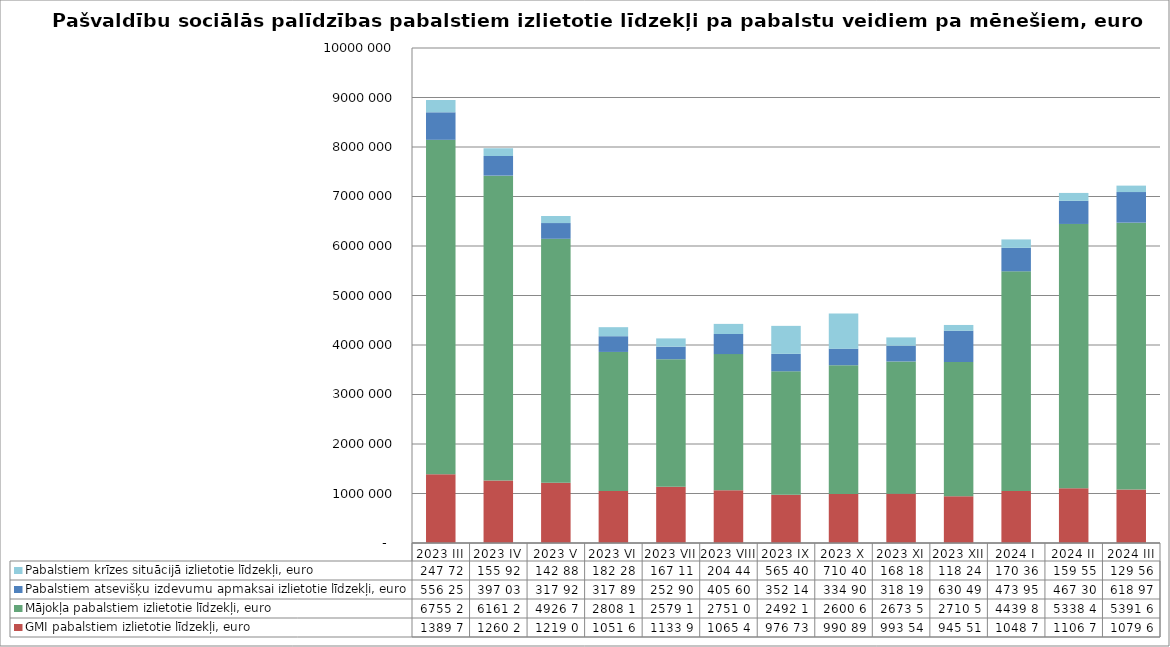
| Category | GMI pabalstiem izlietotie līdzekļi, euro | Mājokļa pabalstiem izlietotie līdzekļi, euro | Pabalstiem atsevišķu izdevumu apmaksai izlietotie līdzekļi, euro | Pabalstiem krīzes situācijā izlietotie līdzekļi, euro |
|---|---|---|---|---|
| 2023 III | 1389797.88 | 6755298.29 | 556252.73 | 247722.95 |
| 2023 IV | 1260284 | 6161284 | 397039 | 155929 |
| 2023 V | 1219045 | 4926766 | 317928 | 142882 |
| 2023 VI | 1051662 | 2808191 | 317892 | 182288 |
| 2023 VII | 1133928 | 2579133.39 | 252905.97 | 167117 |
| 2023 VIII | 1065452 | 2751005 | 405600 | 204448 |
| 2023 IX | 976738 | 2492186 | 352141 | 565409 |
| 2023 X | 990894 | 2600664 | 334905 | 710408 |
| 2023 XI | 993541 | 2673538 | 318191 | 168183 |
| 2023 XII | 945516 | 2710572 | 630495 | 118246 |
| 2024 I | 1048744 | 4439843 | 473954 | 170366 |
| 2024 II | 1106705 | 5338474 | 467308 | 159554 |
| 2024 III | 1079648 | 5391646 | 618976 | 129566 |